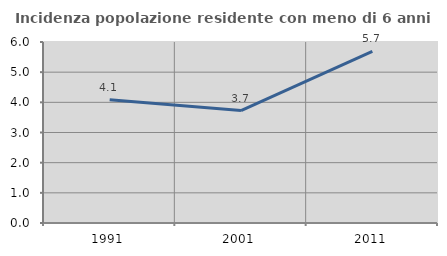
| Category | Incidenza popolazione residente con meno di 6 anni |
|---|---|
| 1991.0 | 4.086 |
| 2001.0 | 3.728 |
| 2011.0 | 5.692 |